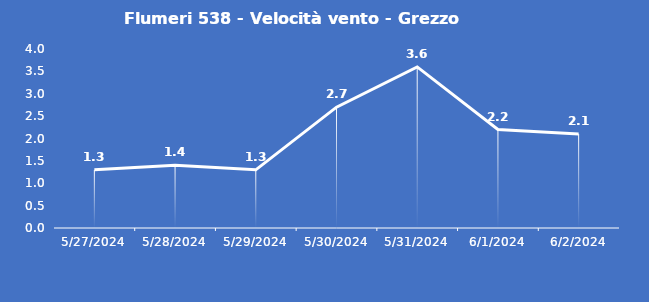
| Category | Flumeri 538 - Velocità vento - Grezzo (m/s) |
|---|---|
| 5/27/24 | 1.3 |
| 5/28/24 | 1.4 |
| 5/29/24 | 1.3 |
| 5/30/24 | 2.7 |
| 5/31/24 | 3.6 |
| 6/1/24 | 2.2 |
| 6/2/24 | 2.1 |